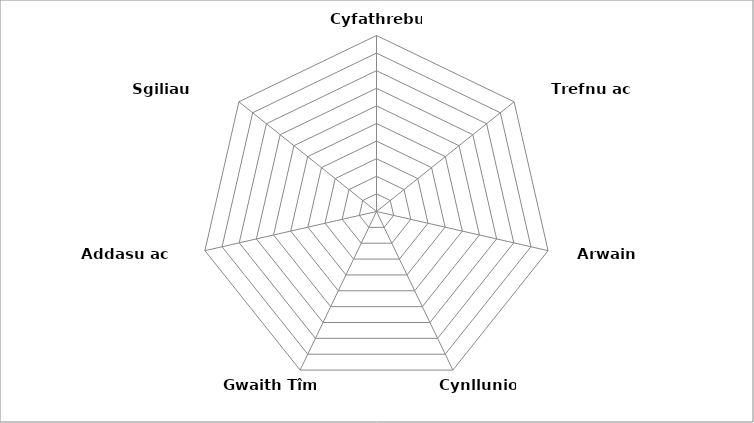
| Category | % |
|---|---|
| Cyfathrebu  | 0 |
| Trefnu ac Amseru  | 0 |
| Arwain Eraill  | 0 |
| Cynllunio  | 0 |
| Gwaith Tîm  | 0 |
| Addasu ac Ymateb  | 0 |
| Sgiliau cymunedol  | 0 |